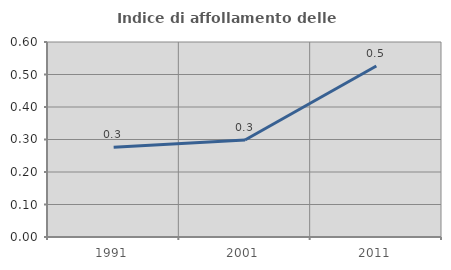
| Category | Indice di affollamento delle abitazioni  |
|---|---|
| 1991.0 | 0.276 |
| 2001.0 | 0.298 |
| 2011.0 | 0.526 |